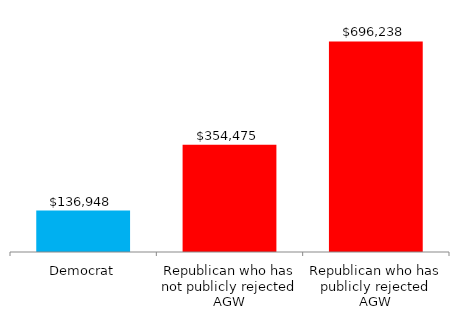
| Category | Series 0 |
|---|---|
| Democrat | 136947.818 |
| Republican who has not publicly rejected AGW | 354475.267 |
| Republican who has publicly rejected AGW | 696237.667 |